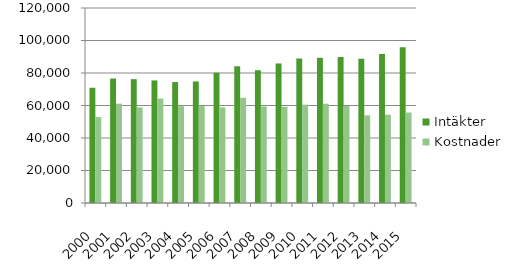
| Category | Intäkter | Kostnader |
|---|---|---|
| 2000.0 | 70914 | 52882 |
| 2001.0 | 76589.4 | 61101.7 |
| 2002.0 | 76209 | 58817 |
| 2003.0 | 75442 | 64299 |
| 2004.0 | 74444 | 59569 |
| 2005.0 | 74809 | 59661 |
| 2006.0 | 80138 | 58837 |
| 2007.0 | 84157 | 64706 |
| 2008.0 | 81727 | 59388 |
| 2009.0 | 85803 | 59252 |
| 2010.0 | 88966 | 60509 |
| 2011.0 | 89436 | 61086 |
| 2012.0 | 89922.5 | 59642.6 |
| 2013.0 | 88709.8 | 53969 |
| 2014.0 | 91692 | 54352 |
| 2015.0 | 95795 | 55673 |